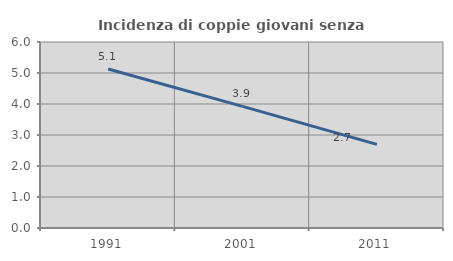
| Category | Incidenza di coppie giovani senza figli |
|---|---|
| 1991.0 | 5.131 |
| 2001.0 | 3.925 |
| 2011.0 | 2.699 |